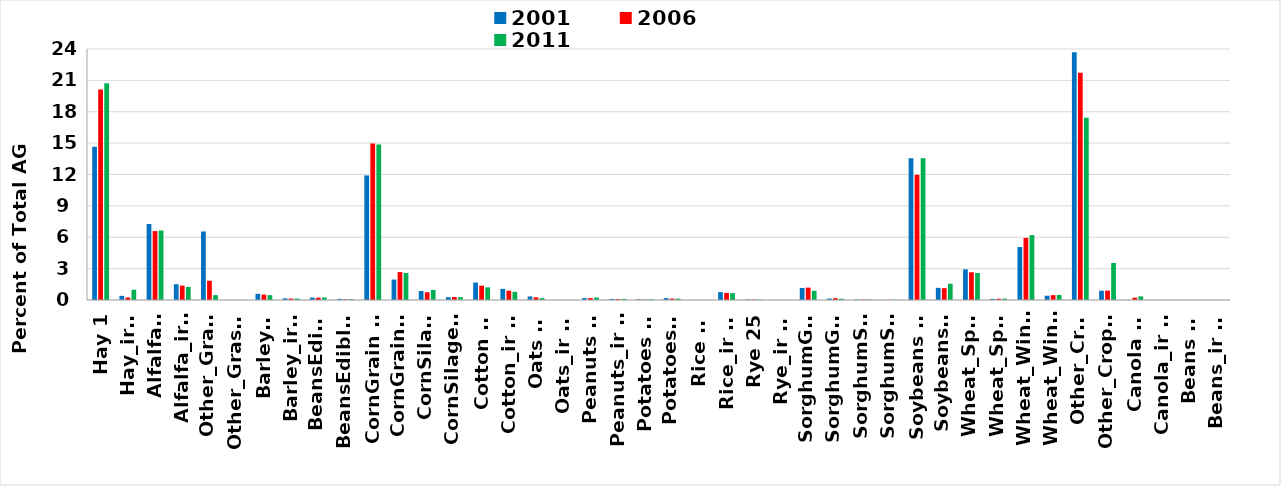
| Category | 2001 | 2006 | 2011 |
|---|---|---|---|
| Hay 1 | 14.645 | 20.126 | 20.726 |
| Hay_ir 2 | 0.394 | 0.24 | 0.98 |
| Alfalfa 3 | 7.268 | 6.586 | 6.645 |
| Alfalfa_ir 4 | 1.505 | 1.376 | 1.25 |
| Other_Grass 5 | 6.552 | 1.844 | 0.465 |
| Other_Grass_ir 6 | 0 | 0 | 0 |
| Barley 7 | 0.592 | 0.514 | 0.465 |
| Barley_ir 8 | 0.161 | 0.134 | 0.137 |
| BeansEdible 9 | 0.229 | 0.221 | 0.248 |
| BeansEdible_ir 10 | 0.106 | 0.063 | 0.071 |
| CornGrain 11 | 11.914 | 14.956 | 14.875 |
| CornGrain_ir 12 | 1.955 | 2.668 | 2.591 |
| CornSilage 13 | 0.852 | 0.741 | 0.97 |
| CornSilage_ir 14 | 0.267 | 0.289 | 0.276 |
| Cotton 15 | 1.665 | 1.374 | 1.209 |
| Cotton_ir 16 | 1.063 | 0.887 | 0.779 |
| Oats 17 | 0.341 | 0.254 | 0.178 |
| Oats_ir 18 | 0.013 | 0.01 | 0.007 |
| Peanuts 19 | 0.175 | 0.181 | 0.241 |
| Peanuts_ir 20 | 0.103 | 0.088 | 0.104 |
| Potatoes 21 | 0.063 | 0.033 | 0.06 |
| Potatoes_ir 22 | 0.182 | 0.138 | 0.13 |
| Rice 23 | 0 | 0 | 0 |
| Rice_ir 24 | 0.749 | 0.673 | 0.657 |
| Rye 25 | 0.051 | 0.045 | 0.042 |
| Rye_ir 26 | 0.001 | 0.001 | 0.002 |
| SorghumGrain 27 | 1.151 | 1.184 | 0.881 |
| SorghumGrain_ir 28 | 0.134 | 0.173 | 0.119 |
| SorghumSilage 29 | 0.046 | 0.044 | 0.047 |
| SorghumSilage_ir 30 | 0.014 | 0.03 | 0.023 |
| Soybeans 31 | 13.546 | 11.97 | 13.564 |
| Soybeans_ir 32 | 1.159 | 1.131 | 1.557 |
| Wheat_Spring 33 | 2.932 | 2.65 | 2.584 |
| Wheat_Spring_ir 34 | 0.108 | 0.119 | 0.128 |
| Wheat_Winter 35 | 5.065 | 5.936 | 6.208 |
| Wheat_Winter_ir 36 | 0.41 | 0.465 | 0.486 |
| Other_Crop 37 | 23.694 | 21.737 | 17.417 |
| Other_Crop_ir 38 | 0.885 | 0.899 | 3.537 |
| Canola 39 | 0.009 | 0.221 | 0.343 |
| Canola_ir 40 | 0 | 0 | 0 |
| Beans 41 | 0 | 0 | 0 |
| Beans_ir 42 | 0 | 0 | 0 |